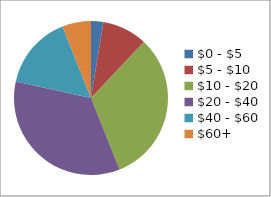
| Category | Series 0 |
|---|---|
| $0 - $5 | 3 |
| $5 - $10 | 11 |
| $10 - $20 | 37 |
| $20 - $40 | 40 |
| $40 - $60 | 18 |
| $60+ | 7 |